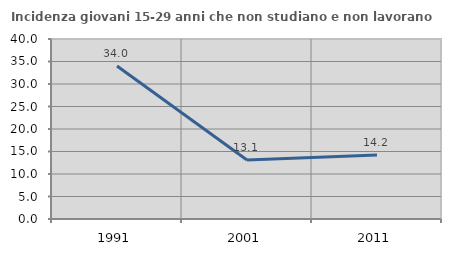
| Category | Incidenza giovani 15-29 anni che non studiano e non lavorano  |
|---|---|
| 1991.0 | 34 |
| 2001.0 | 13.093 |
| 2011.0 | 14.244 |